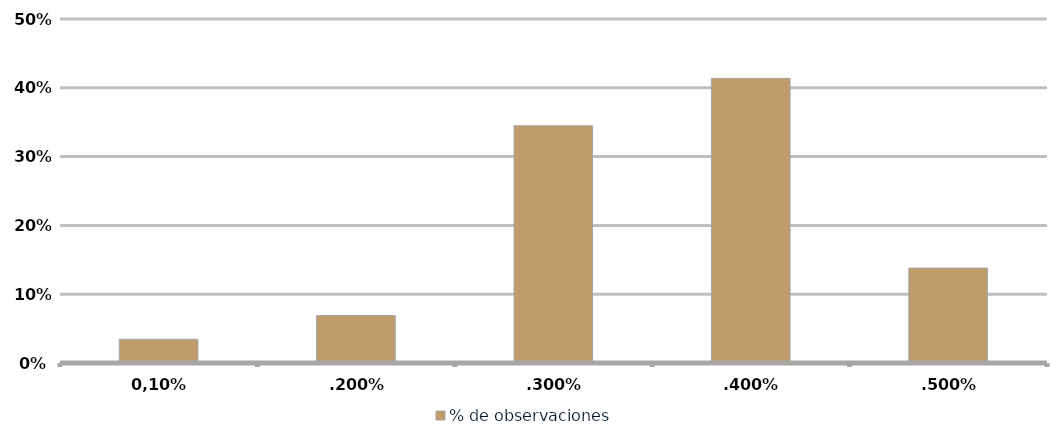
| Category | % de observaciones  |
|---|---|
| 0,10% | 0.034 |
| 0,20% | 0.069 |
| 0,30% | 0.345 |
| 0,40% | 0.414 |
| 0,50% | 0.138 |